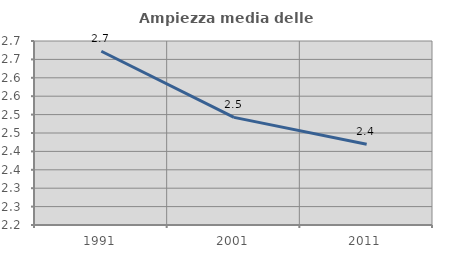
| Category | Ampiezza media delle famiglie |
|---|---|
| 1991.0 | 2.672 |
| 2001.0 | 2.492 |
| 2011.0 | 2.419 |